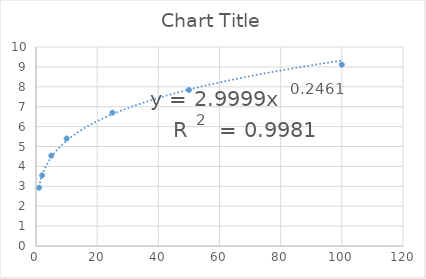
| Category | Series 0 |
|---|---|
| 1.0 | 2.93 |
| 2.0 | 3.55 |
| 5.0 | 4.54 |
| 10.0 | 5.4 |
| 25.0 | 6.7 |
| 50.0 | 7.84 |
| 100.0 | 9.11 |